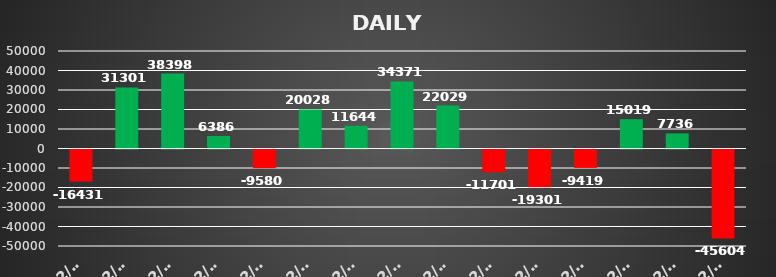
| Category | Series 0 |
|---|---|
| 2021-02-02 | -16431.03 |
| 2021-02-04 | 31301.127 |
| 2021-02-05 | 38398.24 |
| 2021-02-08 | 6386.05 |
| 2021-02-09 | -9580.176 |
| 2021-02-10 | 20028.015 |
| 2021-02-15 | 11644.155 |
| 2021-02-16 | 34371 |
| 2021-02-17 | 22028.976 |
| 2021-02-18 | -11701.34 |
| 2021-02-19 | -19300.662 |
| 2021-02-22 | -9419.4 |
| 2021-02-23 | 15018.6 |
| 2021-02-24 | 7736.344 |
| 2021-02-25 | -45603.819 |